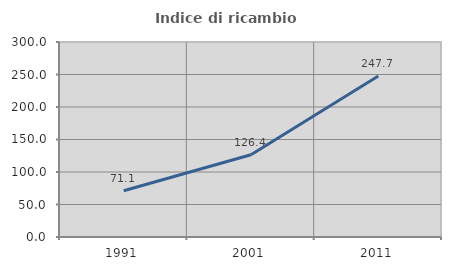
| Category | Indice di ricambio occupazionale  |
|---|---|
| 1991.0 | 71.05 |
| 2001.0 | 126.441 |
| 2011.0 | 247.742 |